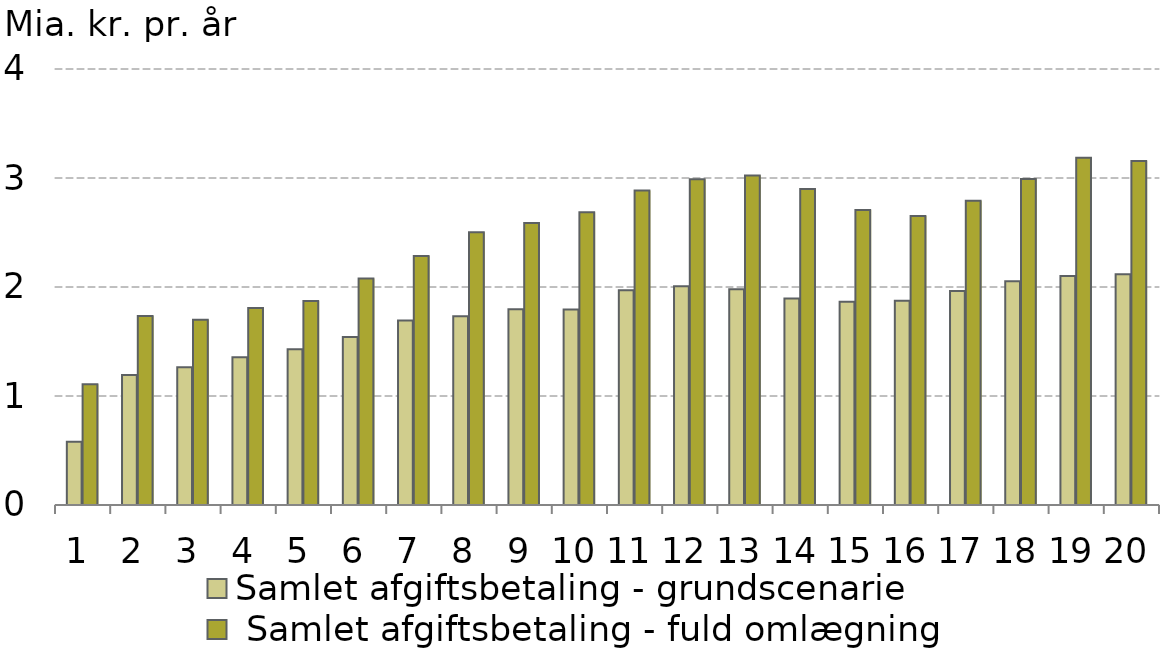
| Category |  Samlet afgiftsbetaling - grundscenarie |  Samlet afgiftsbetaling - fuld omlægning |
|---|---|---|
| 0 | 0.58 | 1.109 |
| 1 | 1.192 | 1.735 |
| 2 | 1.263 | 1.7 |
| 3 | 1.356 | 1.808 |
| 4 | 1.429 | 1.87 |
| 5 | 1.542 | 2.078 |
| 6 | 1.692 | 2.285 |
| 7 | 1.732 | 2.503 |
| 8 | 1.796 | 2.588 |
| 9 | 1.793 | 2.687 |
| 10 | 1.969 | 2.886 |
| 11 | 2.007 | 2.989 |
| 12 | 1.978 | 3.023 |
| 13 | 1.895 | 2.9 |
| 14 | 1.864 | 2.706 |
| 15 | 1.874 | 2.65 |
| 16 | 1.964 | 2.792 |
| 17 | 2.052 | 2.99 |
| 18 | 2.1 | 3.185 |
| 19 | 2.118 | 3.157 |